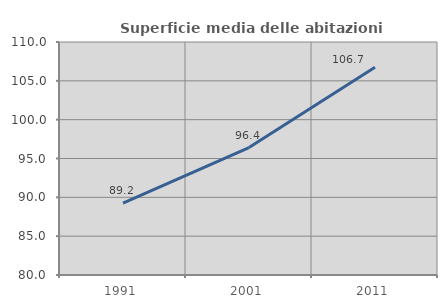
| Category | Superficie media delle abitazioni occupate |
|---|---|
| 1991.0 | 89.247 |
| 2001.0 | 96.414 |
| 2011.0 | 106.736 |